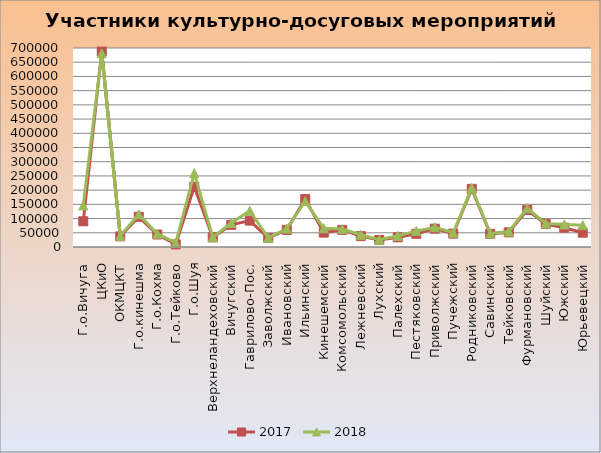
| Category | 2017 | 2018 |
|---|---|---|
| Г.о.Вичуга | 90422 | 146201 |
| ЦКиО | 687450 | 681134 |
| ОКМЦКТ | 37355 | 38984 |
| Г.о.кинешма | 106200 | 114937 |
| Г.о.Кохма | 44002 | 46750 |
| Г.о.Тейково | 9084 | 14218 |
| Г.о.Шуя | 212040 | 259370 |
| Верхнеландеховский | 33916 | 34412 |
| Вичугский | 77951 | 84455 |
| Гаврилово-Пос. | 92884 | 127671 |
| Заволжский | 31318 | 32379 |
| Ивановский | 60319 | 65112 |
| Ильинский | 168720 | 161272 |
| Кинешемский | 50498 | 65800 |
| Комсомольский | 60115 | 62967 |
| Лежневский | 38286 | 42926 |
| Лухский | 24671 | 25598 |
| Палехский | 34043 | 39317 |
| Пестяковский | 46523 | 55906 |
| Приволжский | 64490 | 69632 |
| Пучежский | 46960 | 50250 |
| Родниковский | 204603 | 208151 |
| Савинский | 46278 | 47672 |
| Тейковский | 51527 | 54277 |
| Фурмановский | 130218 | 136363 |
| Шуйский | 80685 | 82247 |
| Южский | 67866 | 79452 |
| Юрьевецкий | 50319 | 76864 |